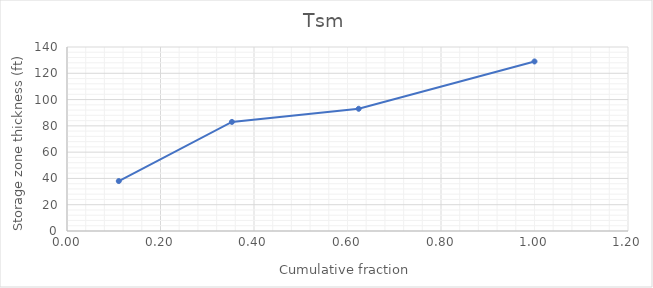
| Category | Series 0 |
|---|---|
| 0.11078717201166181 | 38 |
| 0.35276967930029157 | 83 |
| 0.6239067055393586 | 93 |
| 1.0 | 129 |